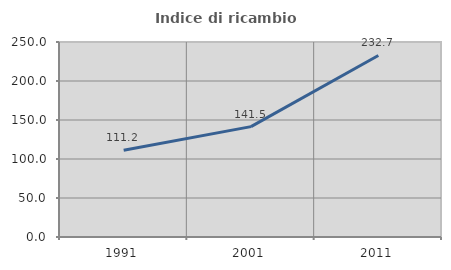
| Category | Indice di ricambio occupazionale  |
|---|---|
| 1991.0 | 111.237 |
| 2001.0 | 141.508 |
| 2011.0 | 232.723 |